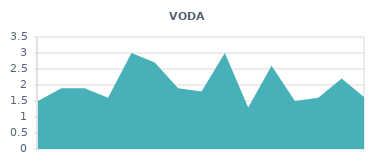
| Category | VODA (L) |
|---|---|
| 0 | 1.5 |
| 1 | 1.9 |
| 2 | 1.9 |
| 3 | 1.6 |
| 4 | 3 |
| 5 | 2.7 |
| 6 | 1.9 |
| 7 | 1.8 |
| 8 | 3 |
| 9 | 1.3 |
| 10 | 2.6 |
| 11 | 1.5 |
| 12 | 1.6 |
| 13 | 2.2 |
| 14 | 1.6 |